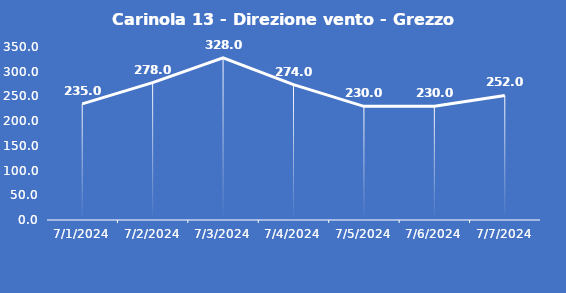
| Category | Carinola 13 - Direzione vento - Grezzo (°N) |
|---|---|
| 7/1/24 | 235 |
| 7/2/24 | 278 |
| 7/3/24 | 328 |
| 7/4/24 | 274 |
| 7/5/24 | 230 |
| 7/6/24 | 230 |
| 7/7/24 | 252 |